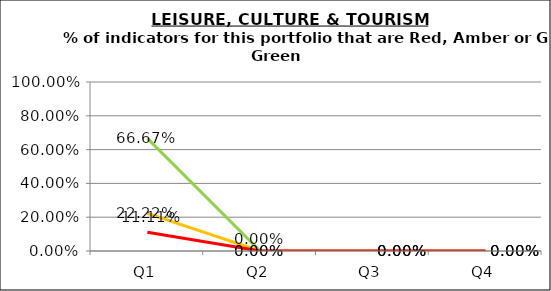
| Category | Green | Amber | Red |
|---|---|---|---|
| Q1 | 0.667 | 0.222 | 0.111 |
| Q2 | 0 | 0 | 0 |
| Q3 | 0 | 0 | 0 |
| Q4 | 0 | 0 | 0 |